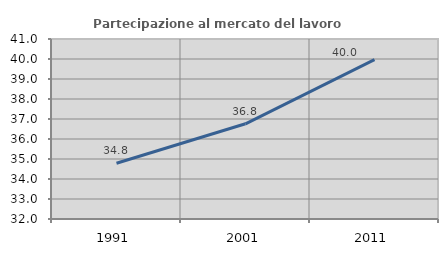
| Category | Partecipazione al mercato del lavoro  femminile |
|---|---|
| 1991.0 | 34.785 |
| 2001.0 | 36.76 |
| 2011.0 | 39.973 |